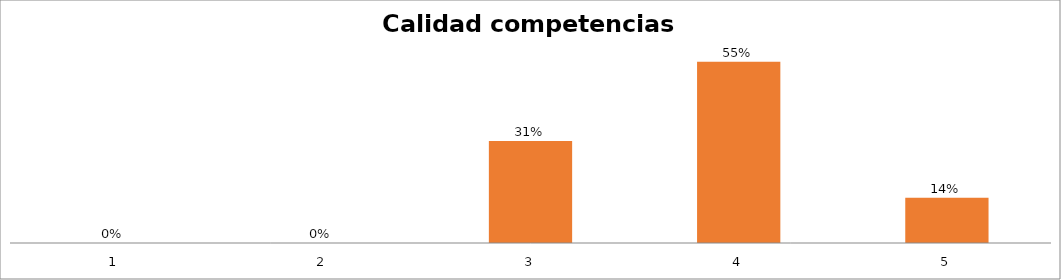
| Category | Series 1 |
|---|---|
| 0 | 0 |
| 1 | 0 |
| 2 | 0.31 |
| 3 | 0.552 |
| 4 | 0.138 |